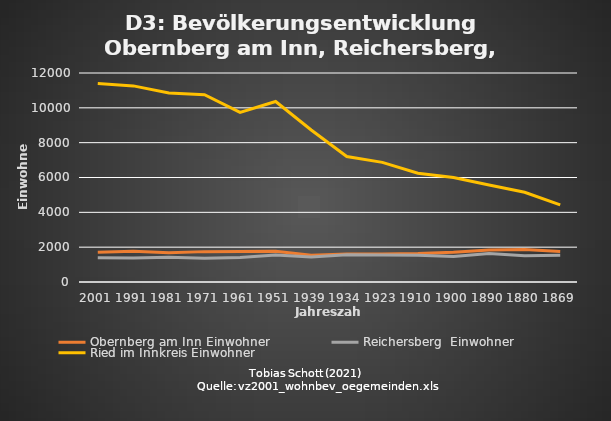
| Category | Obernberg am Inn | Reichersberg  | Ried im Innkreis |
|---|---|---|---|
| 2001.0 | 1703 | 1399 | 11404 |
| 1991.0 | 1759 | 1379 | 11260 |
| 1981.0 | 1677 | 1425 | 10855 |
| 1971.0 | 1744 | 1369 | 10758 |
| 1961.0 | 1746 | 1406 | 9741 |
| 1951.0 | 1772 | 1550 | 10363 |
| 1939.0 | 1532 | 1442 | 8730 |
| 1934.0 | 1611 | 1559 | 7204 |
| 1923.0 | 1608 | 1553 | 6869 |
| 1910.0 | 1632 | 1530 | 6245 |
| 1900.0 | 1702 | 1471 | 5997 |
| 1890.0 | 1834 | 1630 | 5567 |
| 1880.0 | 1871 | 1507 | 5155 |
| 1869.0 | 1755 | 1530 | 4428 |